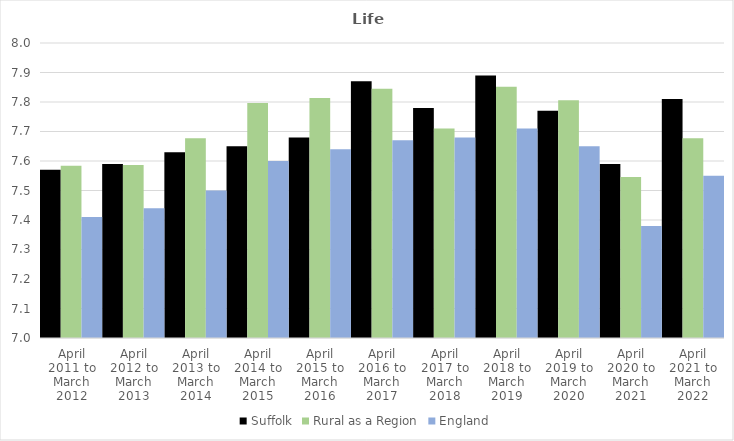
| Category | Suffolk | Rural as a Region | England |
|---|---|---|---|
| April 2011 to March 2012 | 7.57 | 7.584 | 7.41 |
| April 2012 to March 2013 | 7.59 | 7.586 | 7.44 |
| April 2013 to March 2014 | 7.63 | 7.677 | 7.5 |
| April 2014 to March 2015 | 7.65 | 7.797 | 7.6 |
| April 2015 to March 2016 | 7.68 | 7.813 | 7.64 |
| April 2016 to March 2017 | 7.87 | 7.845 | 7.67 |
| April 2017 to March 2018 | 7.78 | 7.71 | 7.68 |
| April 2018 to March 2019 | 7.89 | 7.852 | 7.71 |
| April 2019 to March 2020 | 7.77 | 7.806 | 7.65 |
| April 2020 to March 2021 | 7.59 | 7.546 | 7.38 |
| April 2021 to March 2022 | 7.81 | 7.677 | 7.55 |